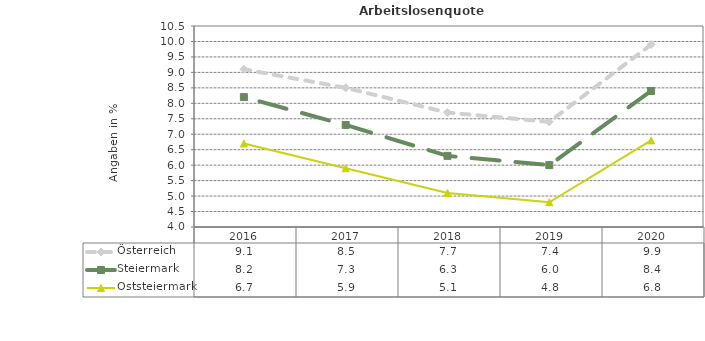
| Category | Österreich | Steiermark | Oststeiermark |
|---|---|---|---|
| 2020.0 | 9.9 | 8.4 | 6.8 |
| 2019.0 | 7.4 | 6 | 4.8 |
| 2018.0 | 7.7 | 6.3 | 5.1 |
| 2017.0 | 8.5 | 7.3 | 5.9 |
| 2016.0 | 9.1 | 8.2 | 6.7 |